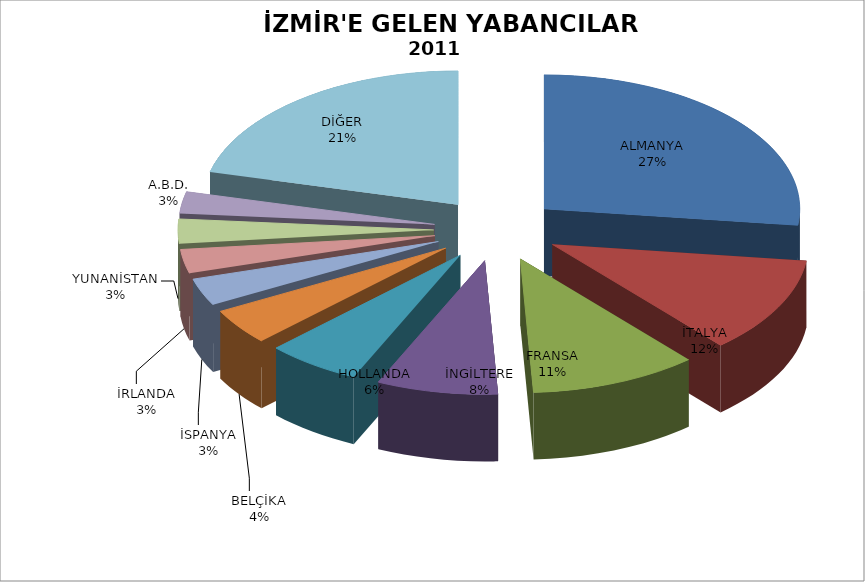
| Category | Series 0 |
|---|---|
| ALMANYA | 374237 |
| İTALYA | 161320 |
| FRANSA | 147179 |
| İNGİLTERE | 106359 |
| HOLLANDA | 82735 |
| BELÇİKA | 60553 |
| İSPANYA | 45758 |
| İRLANDA | 40129 |
| YUNANİSTAN | 41066 |
| A.B.D. | 36350 |
| DİĞER | 292585 |